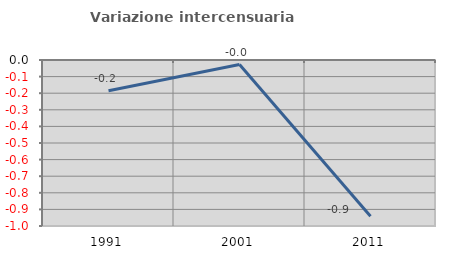
| Category | Variazione intercensuaria annua |
|---|---|
| 1991.0 | -0.185 |
| 2001.0 | -0.027 |
| 2011.0 | -0.942 |